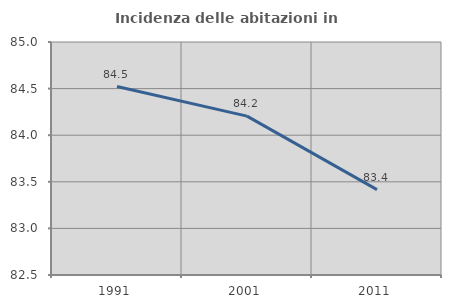
| Category | Incidenza delle abitazioni in proprietà  |
|---|---|
| 1991.0 | 84.522 |
| 2001.0 | 84.205 |
| 2011.0 | 83.416 |